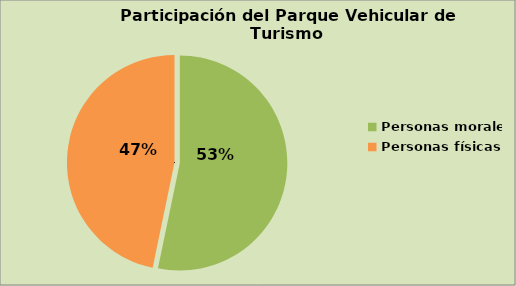
| Category | Series 0 |
|---|---|
| Personas morales | 53.26 |
| Personas físicas | 46.74 |